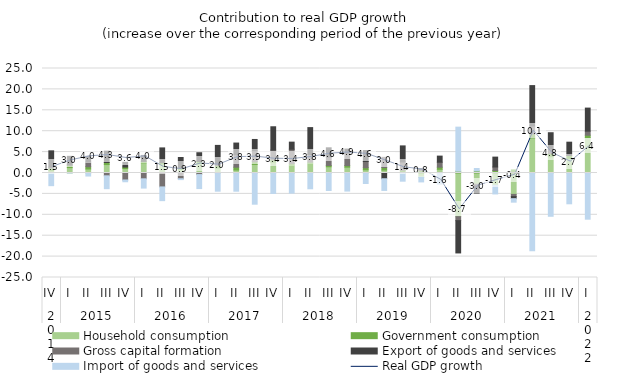
| Category | Household consumption | Government consumption | Gross capital formation | Export of goods and services | Import of goods and services |
|---|---|---|---|---|---|
| 0 | 0.524 | 0.634 | 0.238 | 3.907 | -3.031 |
| 1 | 1.292 | 0.594 | 0.024 | 2.072 | -0.009 |
| 2 | 0.957 | 0.546 | 1.113 | 1.376 | -0.729 |
| 3 | 2.021 | 0.497 | -0.672 | 2.712 | -3.08 |
| 4 | 1.049 | 0.366 | -1.669 | 1.14 | -0.427 |
| 5 | 2.447 | 0.324 | -1.389 | 1.432 | -2.22 |
| 6 | 2.16 | 0.314 | -3.328 | 3.53 | -3.287 |
| 7 | 0.891 | 0.379 | -1.378 | 2.437 | -0.202 |
| 8 | 2.229 | 0.538 | -0.378 | 2.081 | -3.346 |
| 9 | 1.204 | 0.598 | 0.319 | 4.483 | -4.35 |
| 10 | 0.71 | 0.679 | 2.98 | 2.795 | -4.355 |
| 11 | 2.048 | 0.653 | 2.631 | 2.692 | -7.465 |
| 12 | 2.609 | 0.535 | 2.344 | 5.574 | -4.893 |
| 13 | 1.814 | 0.428 | 3.444 | 1.698 | -4.811 |
| 14 | 2.276 | 0.33 | 1.821 | 6.434 | -3.775 |
| 15 | 1.489 | 0.316 | 2.036 | 2.189 | -4.189 |
| 16 | 1.392 | 0.386 | 3.023 | 0.92 | -4.325 |
| 17 | 0.771 | 0.499 | 1.487 | 2.615 | -2.514 |
| 18 | 0.706 | 0.592 | 2.447 | -1.372 | -2.804 |
| 19 | 0.049 | 0.625 | 1.976 | 3.834 | -1.96 |
| 20 | -0.964 | 0.581 | 0.254 | 0.193 | -1.167 |
| 21 | 0.882 | 0.508 | 1.189 | 1.462 | -2.672 |
| 22 | -10.442 | 0.434 | -0.957 | -7.725 | 10.535 |
| 23 | -2.693 | 0.488 | -0.413 | -1.693 | 0.584 |
| 24 | -2.942 | 0.601 | 0.834 | 2.366 | -2.067 |
| 25 | -5.116 | 0.739 | -0.533 | -0.49 | -0.836 |
| 26 | 8.407 | 0.9 | 1.952 | 9.65 | -18.598 |
| 27 | 3.876 | 0.799 | 1.048 | 3.91 | -10.353 |
| 28 | 3.507 | 0.676 | 0.05 | 3.14 | -7.367 |
| 29 | 8.486 | 0.556 | 0.968 | 5.516 | -11.052 |